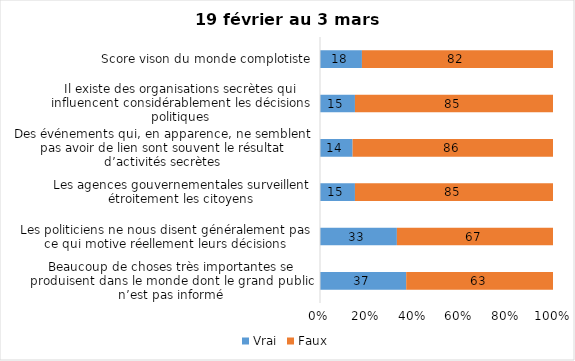
| Category | Vrai | Faux |
|---|---|---|
| Beaucoup de choses très importantes se produisent dans le monde dont le grand public n’est pas informé | 37 | 63 |
| Les politiciens ne nous disent généralement pas ce qui motive réellement leurs décisions | 33 | 67 |
| Les agences gouvernementales surveillent étroitement les citoyens | 15 | 85 |
| Des événements qui, en apparence, ne semblent pas avoir de lien sont souvent le résultat d’activités secrètes | 14 | 86 |
| Il existe des organisations secrètes qui influencent considérablement les décisions politiques | 15 | 85 |
| Score vison du monde complotiste | 18 | 82 |